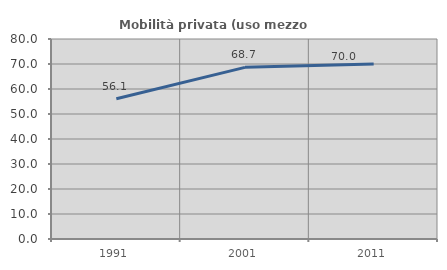
| Category | Mobilità privata (uso mezzo privato) |
|---|---|
| 1991.0 | 56.092 |
| 2001.0 | 68.665 |
| 2011.0 | 70.01 |